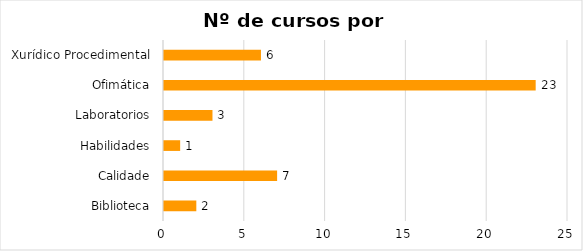
| Category | Series 0 |
|---|---|
| Biblioteca | 2 |
| Calidade | 7 |
| Habilidades | 1 |
| Laboratorios | 3 |
| Ofimática | 23 |
| Xurídico Procedimental | 6 |